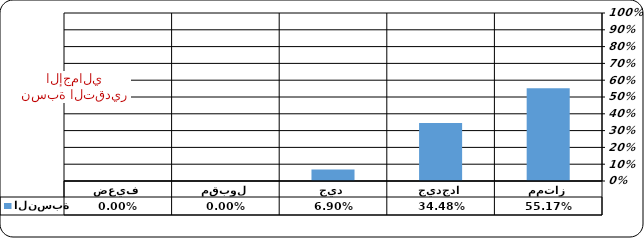
| Category | النسبة |
|---|---|
| ممتاز | 0.552 |
| جيدجدا | 0.345 |
| جيد | 0.069 |
| مقبول | 0 |
| ضعيف | 0 |